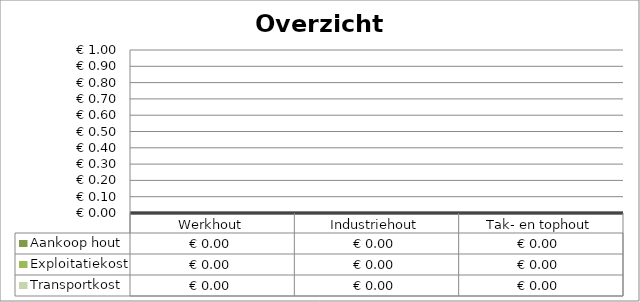
| Category | Aankoop hout | Exploitatiekost | Transportkost |
|---|---|---|---|
| Werkhout | 0 | 0 | 0 |
| Industriehout | 0 | 0 | 0 |
| Tak- en tophout | 0 | 0 | 0 |